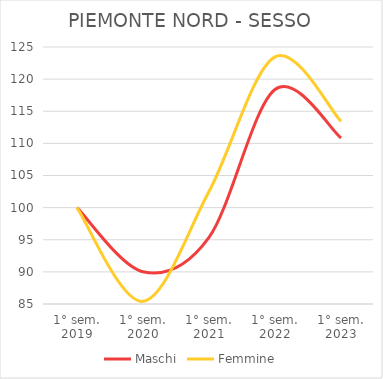
| Category | Maschi | Femmine |
|---|---|---|
| 1° sem.
2019 | 100 | 100 |
| 1° sem.
2020 | 90.02 | 85.418 |
| 1° sem.
2021 | 95.37 | 102.509 |
| 1° sem.
2022 | 118.375 | 123.465 |
| 1° sem.
2023 | 110.845 | 113.421 |